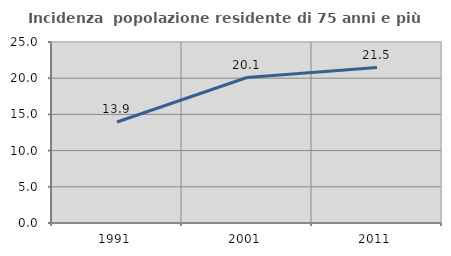
| Category | Incidenza  popolazione residente di 75 anni e più |
|---|---|
| 1991.0 | 13.949 |
| 2001.0 | 20.095 |
| 2011.0 | 21.473 |